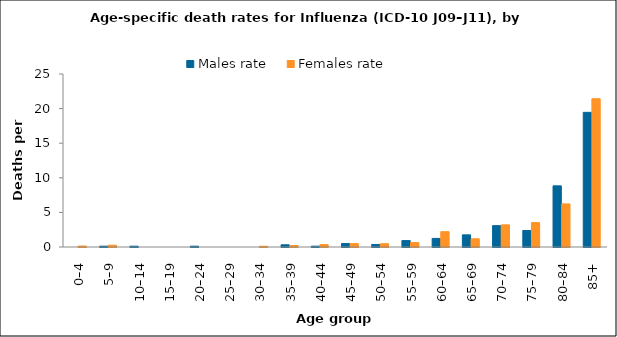
| Category | Males rate | Females rate |
|---|---|---|
| 0–4 | 0 | 0.136 |
| 5–9 | 0.121 | 0.256 |
| 10–14 | 0.119 | 0 |
| 15–19 | 0 | 0 |
| 20–24 | 0.118 | 0 |
| 25–29 | 0 | 0 |
| 30–34 | 0 | 0.103 |
| 35–39 | 0.319 | 0.21 |
| 40–44 | 0.119 | 0.348 |
| 45–49 | 0.498 | 0.488 |
| 50–54 | 0.369 | 0.476 |
| 55–59 | 0.928 | 0.641 |
| 60–64 | 1.24 | 2.217 |
| 65–69 | 1.753 | 1.184 |
| 70–74 | 3.084 | 3.2 |
| 75–79 | 2.389 | 3.523 |
| 80–84 | 8.836 | 6.226 |
| 85+ | 19.461 | 21.427 |